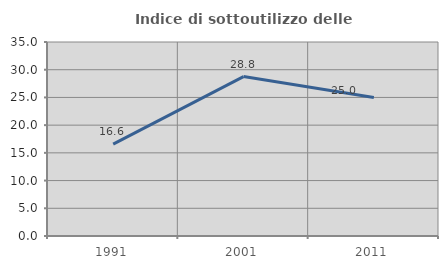
| Category | Indice di sottoutilizzo delle abitazioni  |
|---|---|
| 1991.0 | 16.579 |
| 2001.0 | 28.759 |
| 2011.0 | 24.969 |